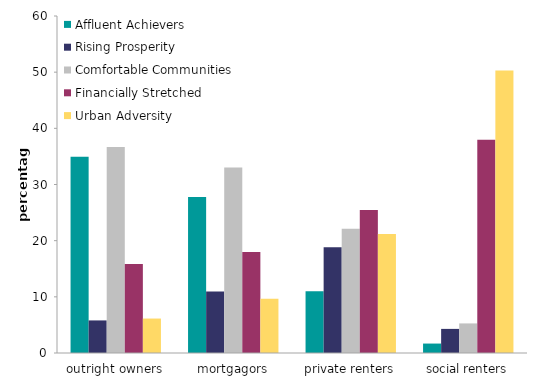
| Category | Affluent Achievers | Rising Prosperity | Comfortable Communities | Financially Stretched | Urban Adversity |
|---|---|---|---|---|---|
| outright owners | 34.941 | 5.8 | 36.679 | 15.837 | 6.134 |
| mortgagors | 27.796 | 10.953 | 33.013 | 17.971 | 9.679 |
| private renters | 10.987 | 18.844 | 22.113 | 25.475 | 21.205 |
| social renters | 1.681 | 4.292 | 5.268 | 37.979 | 50.279 |